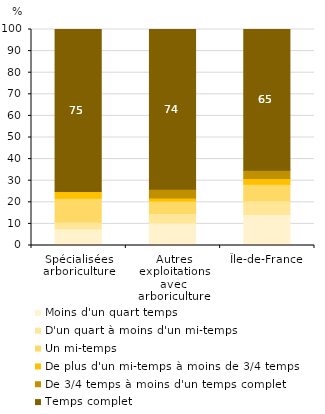
| Category | Moins d'un quart temps | D'un quart à moins d'un mi-temps | Un mi-temps | De plus d'un mi-temps à moins de 3/4 temps | De 3/4 temps à moins d'un temps complet | Temps complet |
|---|---|---|---|---|---|---|
| Spécialisées arboriculture | 7.812 | 3.125 | 10.938 | 3.125 | 0 | 75 |
| Autres exploitations avec arboriculture | 10.473 | 4.392 | 5.743 | 1.351 | 4.054 | 73.986 |
| Île-de-France | 14.384 | 6.349 | 7.636 | 2.612 | 3.809 | 65.21 |